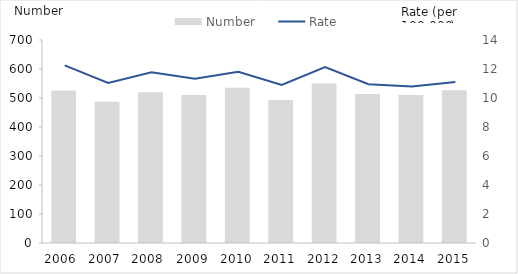
| Category | Number |
|---|---|
| 2006  | 526 |
| 2007  | 487 |
| 2008  | 520 |
| 2009 | 510 |
| 2010 | 535 |
| 2011 | 493 |
| 2012 | 550 |
| 2013 | 514 |
| 2014 | 510 |
| 2015 | 527 |